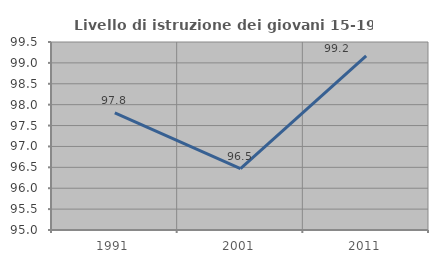
| Category | Livello di istruzione dei giovani 15-19 anni |
|---|---|
| 1991.0 | 97.802 |
| 2001.0 | 96.471 |
| 2011.0 | 99.167 |